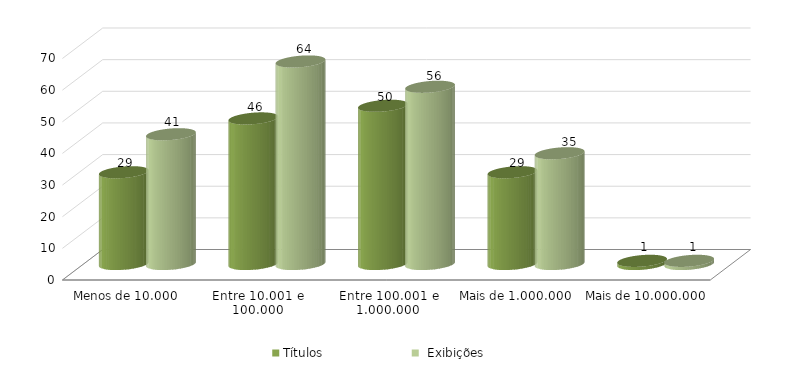
| Category | Títulos |  Exibições |
|---|---|---|
| Menos de 10.000 | 29 | 41 |
| Entre 10.001 e 100.000 | 46 | 64 |
| Entre 100.001 e 1.000.000 | 50 | 56 |
| Mais de 1.000.000 | 29 | 35 |
| Mais de 10.000.000 | 1 | 1 |